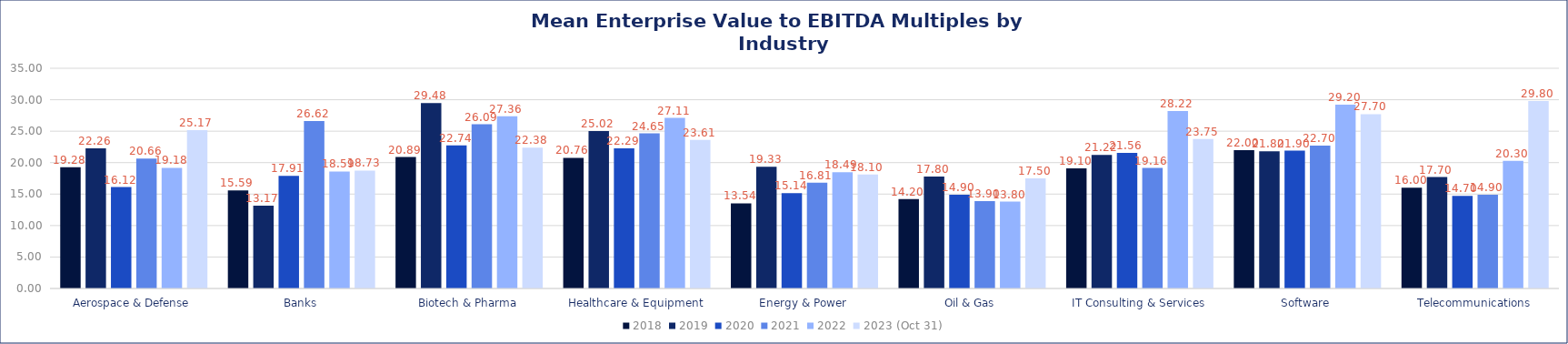
| Category | 2018 | 2019 | 2020 | 2021 | 2022 | 2023 (Oct 31) |
|---|---|---|---|---|---|---|
| Aerospace & Defense | 19.28 | 22.26 | 16.12 | 20.66 | 19.18 | 25.17 |
| Banks | 15.59 | 13.17 | 17.91 | 26.62 | 18.59 | 18.73 |
| Biotech & Pharma | 20.89 | 29.48 | 22.74 | 26.09 | 27.36 | 22.38 |
| Healthcare & Equipment | 20.76 | 25.02 | 22.29 | 24.65 | 27.11 | 23.61 |
| Energy & Power | 13.54 | 19.33 | 15.14 | 16.81 | 18.49 | 18.1 |
| Oil & Gas | 14.2 | 17.8 | 14.9 | 13.9 | 13.8 | 17.5 |
| IT Consulting & Services | 19.1 | 21.22 | 21.56 | 19.16 | 28.22 | 23.75 |
| Software | 22 | 21.8 | 21.9 | 22.7 | 29.2 | 27.7 |
| Telecommunications | 16 | 17.7 | 14.7 | 14.9 | 20.3 | 29.8 |